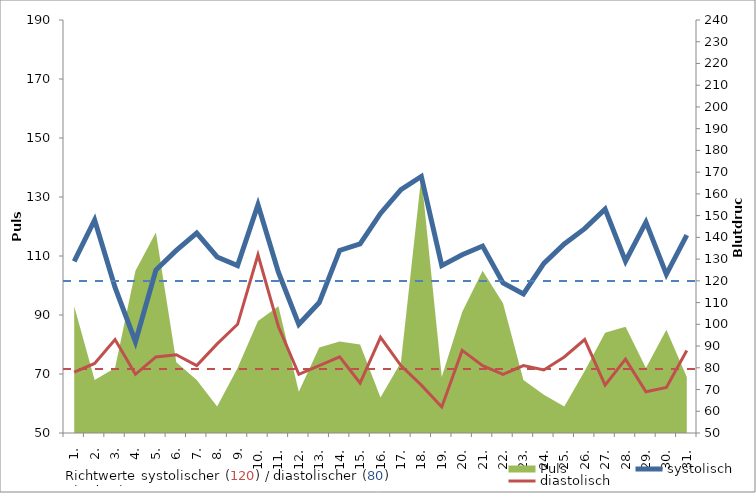
| Category | systolisch | diastolisch |
|---|---|---|
| 1. | 129 | 78 |
| 2. | 148 | 82 |
| 3. | 117 | 93 |
| 4. | 92 | 77 |
| 5. | 125 | 85 |
| 6. | 134 | 86 |
| 7. | 142 | 81 |
| 8. | 131 | 91 |
| 9. | 127 | 100 |
| 10. | 155 | 132 |
| 11. | 124 | 99 |
| 12. | 100 | 77 |
| 13. | 110 | 81 |
| 14. | 134 | 85 |
| 15. | 137 | 73 |
| 16. | 151 | 94 |
| 17. | 162 | 81 |
| 18. | 168 | 72 |
| 19. | 127 | 62 |
| 20. | 132 | 88 |
| 21. | 136 | 81 |
| 22. | 119 | 77 |
| 23. | 114 | 81 |
| 24. | 128 | 79 |
| 25. | 137 | 85 |
| 26. | 144 | 93 |
| 27. | 153 | 72 |
| 28. | 129 | 84 |
| 29. | 147 | 69 |
| 30. | 123 | 71 |
| 31. | 141 | 88 |